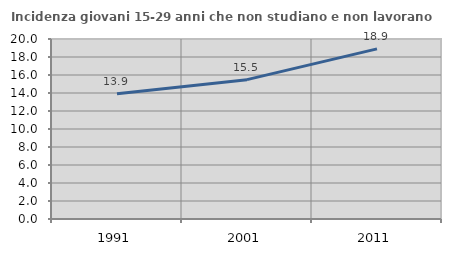
| Category | Incidenza giovani 15-29 anni che non studiano e non lavorano  |
|---|---|
| 1991.0 | 13.917 |
| 2001.0 | 15.482 |
| 2011.0 | 18.903 |